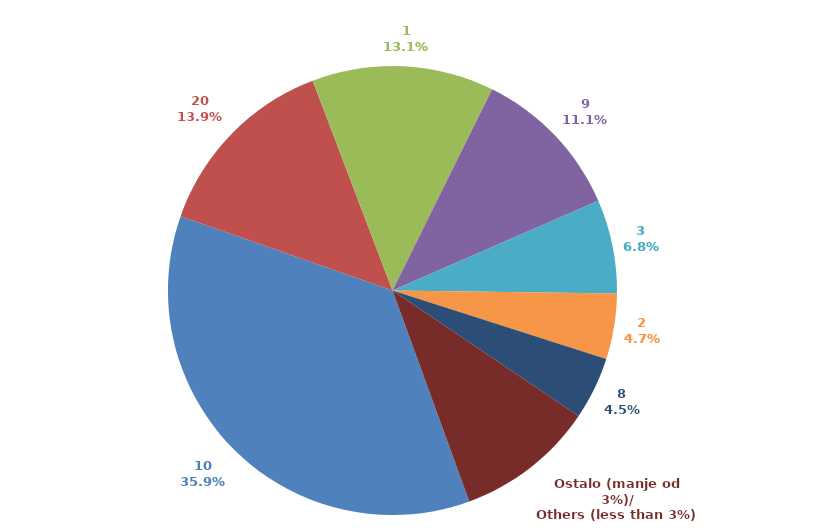
| Category | Series 0 |
|---|---|
| 10 | 0.359 |
| 20 | 0.139 |
| 1 | 0.131 |
| 9 | 0.111 |
| 3 | 0.068 |
| 2 | 0.047 |
| 8 | 0.045 |
| Ostalo (manje od 3%)/
Others (less than 3%) | 0.1 |